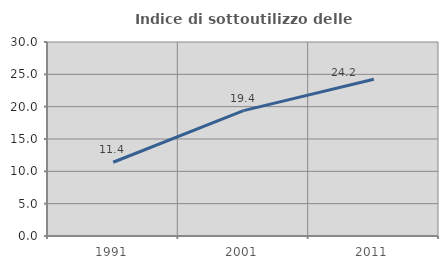
| Category | Indice di sottoutilizzo delle abitazioni  |
|---|---|
| 1991.0 | 11.404 |
| 2001.0 | 19.388 |
| 2011.0 | 24.231 |